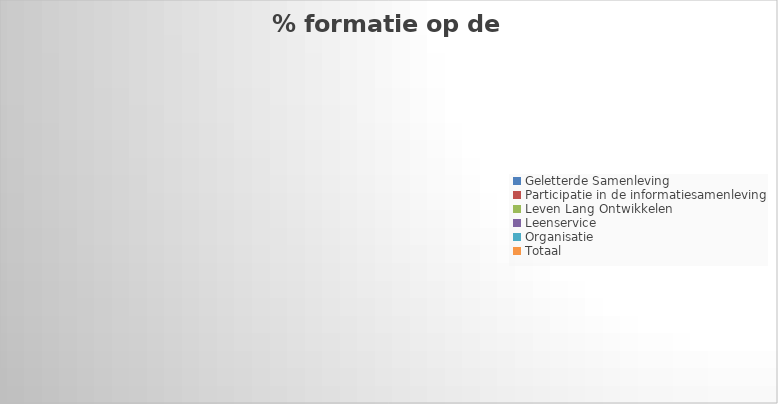
| Category | % formatie op de lijnen |
|---|---|
| Geletterde Samenleving | 0 |
| Participatie in de informatiesamenleving | 0 |
| Leven Lang Ontwikkelen | 0 |
| Leenservice | 0 |
| Organisatie | 0 |
| Totaal | 0 |